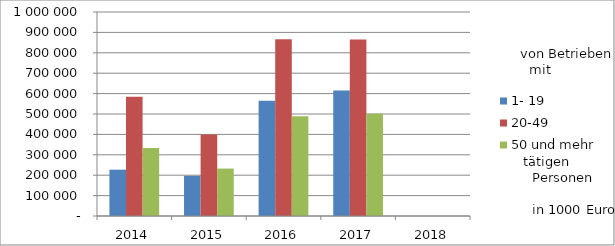
| Category | 1- 19 | 20-49 | 50 und mehr |
|---|---|---|---|
| 2014.0 | 227132.521 | 584877.621 | 332909.543 |
| 2015.0 | 196941.16 | 399161.973 | 232434.682 |
| 2016.0 | 564927.004 | 866402.513 | 488953.198 |
| 2017.0 | 614803.76 | 865068.807 | 500968.958 |
| 2018.0 | 0 | 0 | 0 |